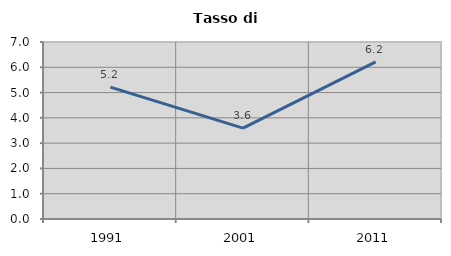
| Category | Tasso di disoccupazione   |
|---|---|
| 1991.0 | 5.215 |
| 2001.0 | 3.593 |
| 2011.0 | 6.214 |